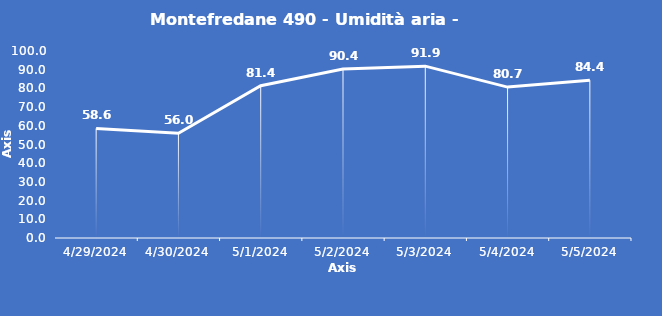
| Category | Montefredane 490 - Umidità aria - Grezzo (%) |
|---|---|
| 4/29/24 | 58.6 |
| 4/30/24 | 56 |
| 5/1/24 | 81.4 |
| 5/2/24 | 90.4 |
| 5/3/24 | 91.9 |
| 5/4/24 | 80.7 |
| 5/5/24 | 84.4 |